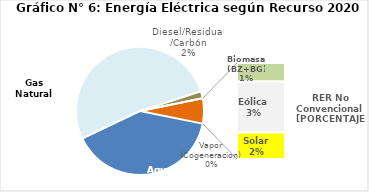
| Category | Series 0 |
|---|---|
| Agua | 1851.763 |
| Gas Natural | 2425.411 |
| Diesel/Residual/Carbón | 84.521 |
| Vapor (Cogeneracion) | 0.205 |
| Biomasa (BZ+BG) | 56.622 |
| Eólica | 157.524 |
| Solar | 81.518 |